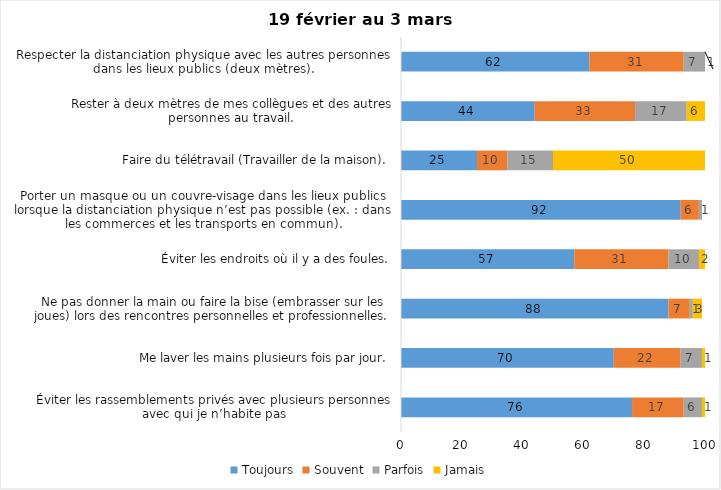
| Category | Toujours | Souvent | Parfois | Jamais |
|---|---|---|---|---|
| Éviter les rassemblements privés avec plusieurs personnes avec qui je n’habite pas | 76 | 17 | 6 | 1 |
| Me laver les mains plusieurs fois par jour. | 70 | 22 | 7 | 1 |
| Ne pas donner la main ou faire la bise (embrasser sur les joues) lors des rencontres personnelles et professionnelles. | 88 | 7 | 1 | 3 |
| Éviter les endroits où il y a des foules. | 57 | 31 | 10 | 2 |
| Porter un masque ou un couvre-visage dans les lieux publics lorsque la distanciation physique n’est pas possible (ex. : dans les commerces et les transports en commun). | 92 | 6 | 1 | 0 |
| Faire du télétravail (Travailler de la maison). | 25 | 10 | 15 | 50 |
| Rester à deux mètres de mes collègues et des autres personnes au travail. | 44 | 33 | 17 | 6 |
| Respecter la distanciation physique avec les autres personnes dans les lieux publics (deux mètres). | 62 | 31 | 7 | 1 |